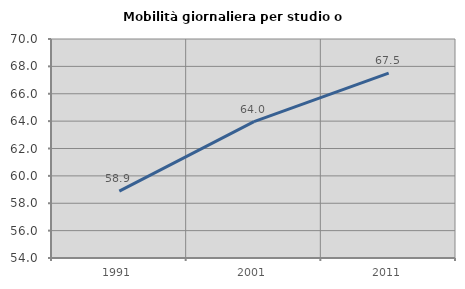
| Category | Mobilità giornaliera per studio o lavoro |
|---|---|
| 1991.0 | 58.891 |
| 2001.0 | 63.966 |
| 2011.0 | 67.501 |